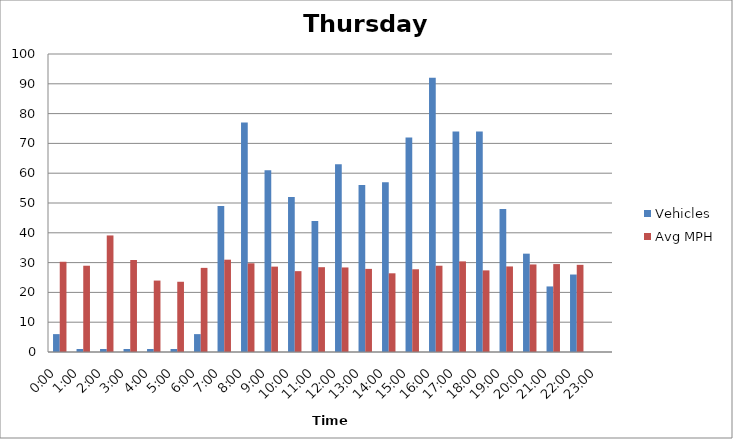
| Category | Vehicles | Avg MPH |
|---|---|---|
| 0:00 | 6 | 30.28 |
| 1:00 | 1 | 28.95 |
| 2:00 | 1 | 39.11 |
| 3:00 | 1 | 30.87 |
| 4:00 | 1 | 23.97 |
| 5:00 | 1 | 23.57 |
| 6:00 | 6 | 28.23 |
| 7:00 | 49 | 30.98 |
| 8:00 | 77 | 29.77 |
| 9:00 | 61 | 28.65 |
| 10:00 | 52 | 27.13 |
| 11:00 | 44 | 28.46 |
| 12:00 | 63 | 28.37 |
| 13:00 | 56 | 27.89 |
| 14:00 | 57 | 26.41 |
| 15:00 | 72 | 27.76 |
| 16:00 | 92 | 28.95 |
| 17:00 | 74 | 30.41 |
| 18:00 | 74 | 27.39 |
| 19:00 | 48 | 28.71 |
| 20:00 | 33 | 29.38 |
| 21:00 | 22 | 29.5 |
| 22:00 | 26 | 29.25 |
| 23:00 | 0 | 0 |